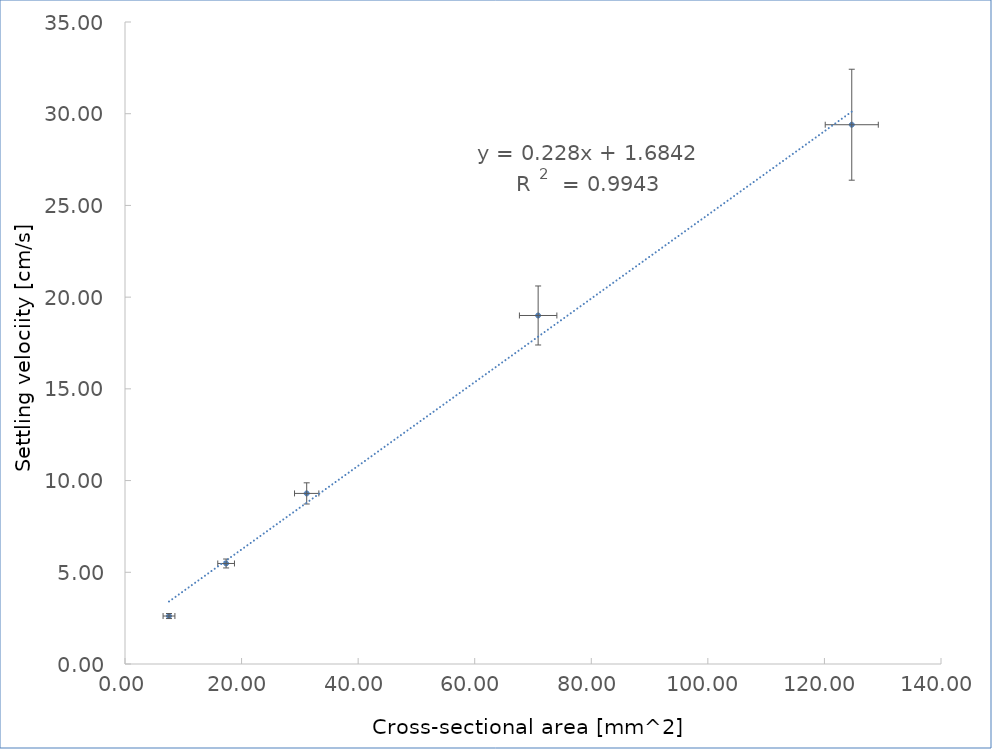
| Category | Series 0 |
|---|---|
| 7.547676350249479 | 2.615 |
| 17.349445429449634 | 5.48 |
| 31.17245310524472 | 9.3 |
| 70.8821842466197 | 19 |
| 124.68981242097888 | 29.4 |